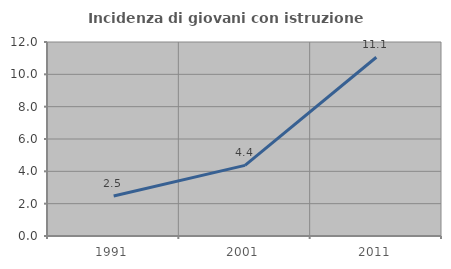
| Category | Incidenza di giovani con istruzione universitaria |
|---|---|
| 1991.0 | 2.469 |
| 2001.0 | 4.367 |
| 2011.0 | 11.058 |